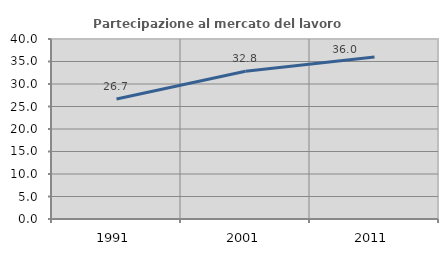
| Category | Partecipazione al mercato del lavoro  femminile |
|---|---|
| 1991.0 | 26.667 |
| 2001.0 | 32.836 |
| 2011.0 | 36.02 |